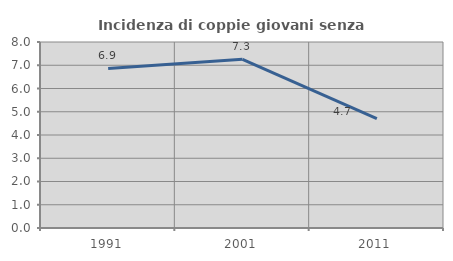
| Category | Incidenza di coppie giovani senza figli |
|---|---|
| 1991.0 | 6.863 |
| 2001.0 | 7.255 |
| 2011.0 | 4.707 |